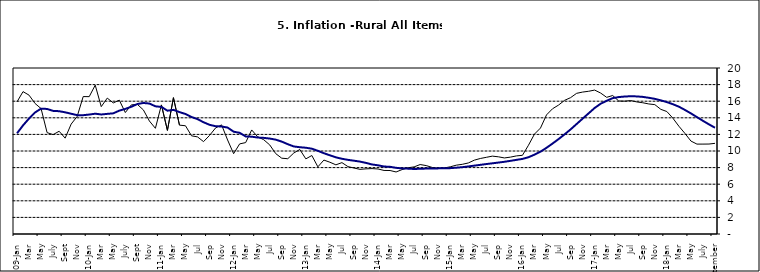
| Category | Series 0 | Series 1 |
|---|---|---|
| 09-Jan | 15.918 | 12.128 |
| Feb | 17.154 | 13.086 |
| Mar | 16.729 | 13.912 |
| Apr | 15.727 | 14.644 |
| May | 15.113 | 15.104 |
| June | 12.213 | 15.067 |
| July | 11.974 | 14.832 |
| Aug | 12.38 | 14.796 |
| Sept | 11.548 | 14.661 |
| Oct | 13.242 | 14.488 |
| Nov | 14.164 | 14.321 |
|  | 16.557 | 14.316 |
| 10-Jan | 16.548 | 14.39 |
| Feb | 17.934 | 14.494 |
| Mar | 15.346 | 14.401 |
| Apr | 16.373 | 14.473 |
| May | 15.794 | 14.54 |
| June | 16.126 | 14.862 |
| July | 14.634 | 15.072 |
| Aug | 15.556 | 15.33 |
| Sept | 15.616 | 15.658 |
| Oct | 14.955 | 15.786 |
| Nov | 13.616 | 15.719 |
| Dec | 12.735 | 15.385 |
| 11-Jan | 15.553 | 15.311 |
| Feb | 12.482 | 14.856 |
| Mar | 16.422 | 14.956 |
| Apr | 13.117 | 14.687 |
| May | 13.041 | 14.457 |
| Jun | 11.83 | 14.095 |
| Jul | 11.699 | 13.84 |
| Aug | 11.13 | 13.464 |
| Sep | 11.878 | 13.156 |
| Oct | 12.778 | 12.985 |
| Nov | 13.147 | 12.95 |
| Dec | 11.326 | 12.824 |
| 12-Jan | 9.678 | 12.33 |
| Feb | 10.856 | 12.188 |
| Mar | 11.014 | 11.76 |
| Apr | 12.536 | 11.724 |
| May | 11.712 | 11.621 |
| Jun | 11.36 | 11.582 |
| Jul | 10.733 | 11.499 |
| Aug | 9.683 | 11.368 |
| Sep | 9.132 | 11.131 |
| Oct | 9.071 | 10.82 |
| Nov | 9.758 | 10.548 |
| Dec | 10.183 | 10.455 |
| 13-Jan | 9.052 | 10.394 |
| Feb | 9.457 | 10.276 |
| Mar | 8.091 | 10.025 |
| Apr | 8.907 | 9.732 |
| May | 8.647 | 9.483 |
| Jun | 8.333 | 9.236 |
| Jul | 8.6 | 9.063 |
| Aug | 8.12 | 8.933 |
| Sep | 7.95 | 8.832 |
| Oct | 7.791 | 8.722 |
| Nov | 7.849 | 8.565 |
| Dec | 7.879 | 8.378 |
| 14-Jan | 7.832 | 8.277 |
| Feb | 7.657 | 8.13 |
| Mar | 7.65 | 8.092 |
| Apr | 7.473 | 7.973 |
| May | 7.761 | 7.901 |
| Jun | 7.98 | 7.874 |
| Jul | 8.086 | 7.834 |
| Aug | 8.368 | 7.858 |
| Sep | 8.244 | 7.883 |
| Oct | 8.019 | 7.903 |
| Nov | 7.898 | 7.906 |
| Dec | 7.955 | 7.913 |
| 15-Jan | 8.094 | 7.935 |
| Feb | 8.291 | 7.988 |
| Mar | 8.396 | 8.05 |
| Apr | 8.556 | 8.14 |
| May | 8.896 | 8.236 |
| Jun | 9.098 | 8.331 |
| Jul | 9.238 | 8.429 |
| Aug | 9.382 | 8.516 |
| Sep | 9.3 | 8.606 |
| Oct | 9.162 | 8.7 |
| Nov | 9.261 | 8.813 |
| Dec | 9.41 | 8.933 |
| 16-Jan | 9.48 | 9.047 |
| Feb | 10.692 | 9.249 |
| Mar | 12.038 | 9.559 |
| Apr | 12.767 | 9.917 |
| May | 14.349 | 10.384 |
| Jun | 15.088 | 10.897 |
| Jul | 15.533 | 11.433 |
| Aug | 16.103 | 12.002 |
| Sep | 16.428 | 12.601 |
| Oct | 16.947 | 13.25 |
| Nov | 17.099 | 13.898 |
| Dec | 17.195 | 14.54 |
| 17-Jan | 17.341 | 15.183 |
| Feb | 16.982 | 15.696 |
| Mar | 16.466 | 16.054 |
| Apr | 16.687 | 16.369 |
| May | 16.023 | 16.497 |
| Jun | 16.007 | 16.563 |
| Jul | 16.078 | 16.6 |
| Aug | 15.914 | 16.577 |
| Sep | 15.812 | 16.52 |
| Oct | 15.666 | 16.411 |
| Nov | 15.587 | 16.285 |
| Dec | 15.018 | 16.104 |
| 18-Jan | 14.756 | 15.892 |
| Feb | 13.957 | 15.638 |
| Mar | 12.987 | 15.339 |
| Apr | 12.126 | 14.95 |
| May | 11.199 | 14.53 |
| June | 10.832 | 14.083 |
| July | 10.831 | 13.636 |
| August | 10.838 | 13.209 |
| September | 10.924 | 12.804 |